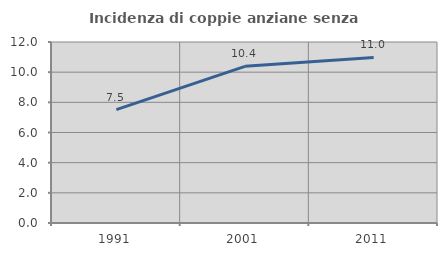
| Category | Incidenza di coppie anziane senza figli  |
|---|---|
| 1991.0 | 7.519 |
| 2001.0 | 10.386 |
| 2011.0 | 10.977 |